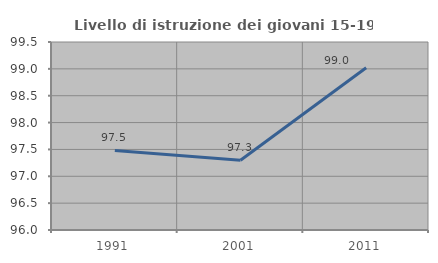
| Category | Livello di istruzione dei giovani 15-19 anni |
|---|---|
| 1991.0 | 97.482 |
| 2001.0 | 97.297 |
| 2011.0 | 99.02 |